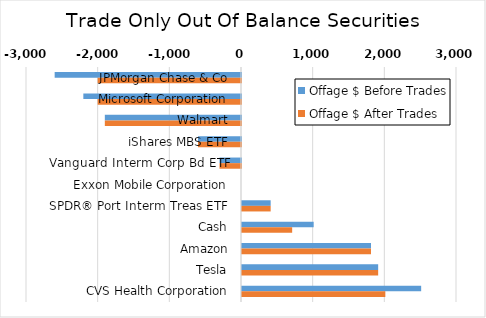
| Category | Offage $ Before Trades | Offage $ After Trades |
|---|---|---|
| JPMorgan Chase & Co | -2600 | -2000 |
| Microsoft Corporation | -2200 | -2000 |
| Walmart | -1900 | -1900 |
| iShares MBS ETF | -600 | -600 |
| Vanguard Interm Corp Bd ETF | -300 | -300 |
| Exxon Mobile Corporation | 0 | 0 |
| SPDR® Port Interm Treas ETF | 400 | 400 |
| Cash | 1000 | 700 |
| Amazon | 1800 | 1800 |
| Tesla | 1900 | 1900 |
| CVS Health Corporation | 2500 | 2000 |